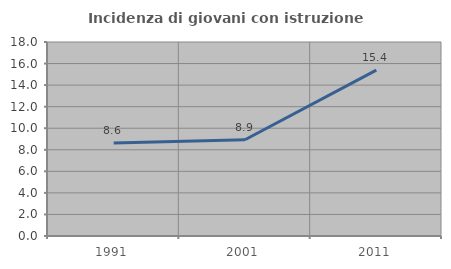
| Category | Incidenza di giovani con istruzione universitaria |
|---|---|
| 1991.0 | 8.621 |
| 2001.0 | 8.929 |
| 2011.0 | 15.385 |